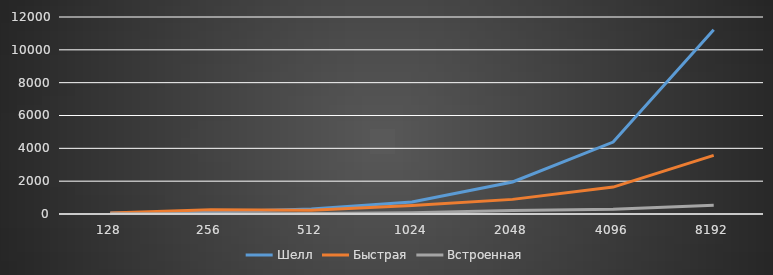
| Category | Шелл | Быстрая | Встроенная |
|---|---|---|---|
| 128.0 | 56.333 | 59.333 | 22 |
| 256.0 | 125.333 | 257.667 | 17.667 |
| 512.0 | 299 | 225.333 | 26.333 |
| 1024.0 | 727.667 | 517.667 | 83.333 |
| 2048.0 | 1952 | 890.667 | 219.667 |
| 4096.0 | 4380.333 | 1638.667 | 294 |
| 8192.0 | 11220.333 | 3567 | 530.667 |